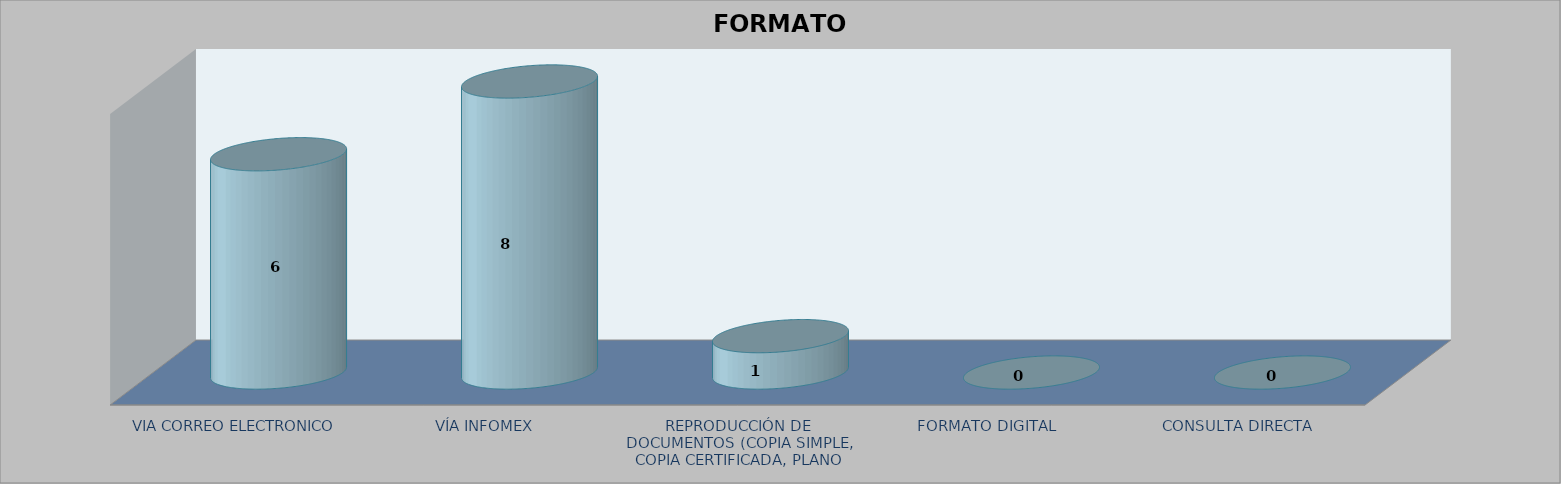
| Category |        FORMATO SOLICITADO | Series 1 | Series 2 |
|---|---|---|---|
| VIA CORREO ELECTRONICO |  |  | 6 |
| VÍA INFOMEX |  |  | 8 |
| REPRODUCCIÓN DE DOCUMENTOS (COPIA SIMPLE, COPIA CERTIFICADA, PLANO SIMPLE Y PLANO CERTIFICADO) |  |  | 1 |
| FORMATO DIGITAL |  |  | 0 |
| CONSULTA DIRECTA |  |  | 0 |